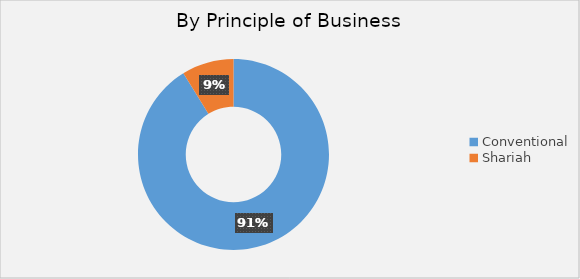
| Category | C. Kepemilikan Simpanan |
|---|---|
| Conventional | 310274819 |
| Shariah | 29932148 |